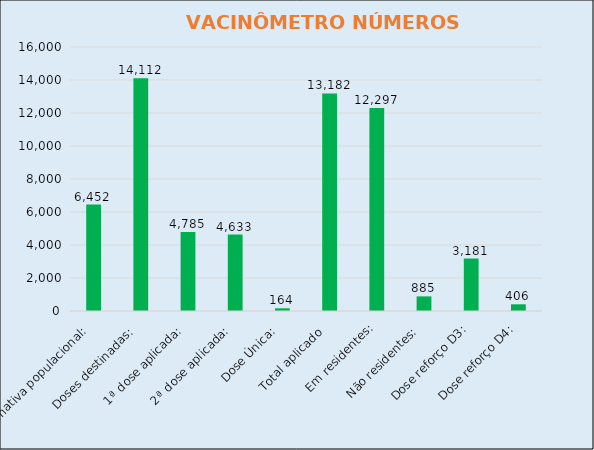
| Category | Series 0 |
|---|---|
| Estimativa populacional:  | 6452 |
| Doses destinadas:  | 14112 |
| 1ª dose aplicada:  | 4785 |
| 2ª dose aplicada:  | 4633 |
| Dose Única:  | 164 |
| Total aplicado  | 13182 |
| Em residentes: | 12297 |
| Não residentes:  | 885 |
| Dose reforço D3: | 3181 |
| Dose reforço D4: | 406 |